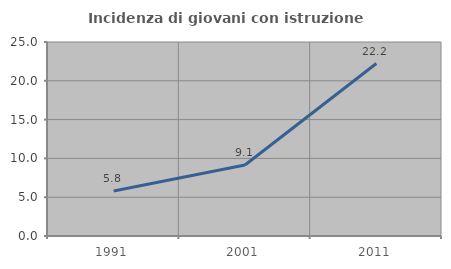
| Category | Incidenza di giovani con istruzione universitaria |
|---|---|
| 1991.0 | 5.804 |
| 2001.0 | 9.146 |
| 2011.0 | 22.222 |